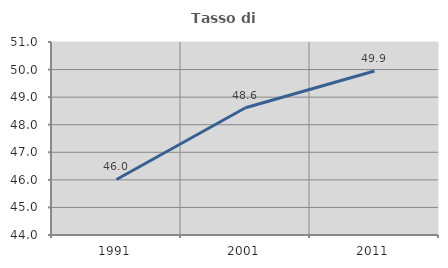
| Category | Tasso di occupazione   |
|---|---|
| 1991.0 | 46.014 |
| 2001.0 | 48.615 |
| 2011.0 | 49.948 |